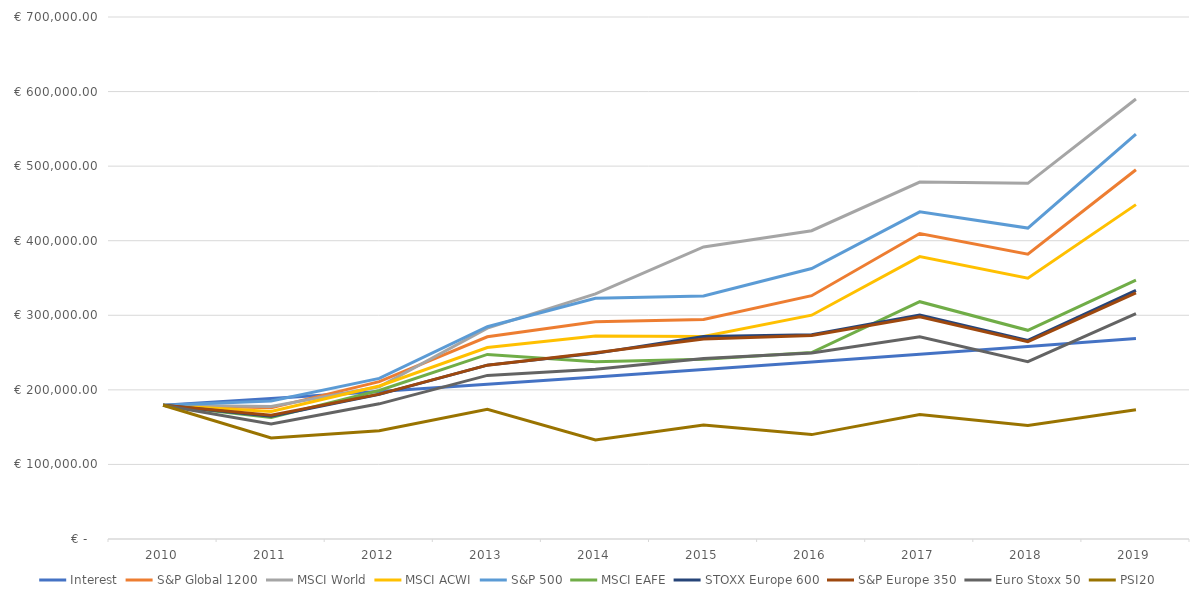
| Category | Interest | S&P Global 1200 | MSCI World | MSCI ACWI | S&P 500 | MSCI EAFE | STOXX Europe 600 | S&P Europe 350 | Euro Stoxx 50 | PSI20 |
|---|---|---|---|---|---|---|---|---|---|---|
| 2010.0 | 179369.678 | 179369.678 | 179369.678 | 179369.678 | 179369.678 | 179369.678 | 179369.678 | 179369.678 | 179369.678 | 179369.678 |
| 2011.0 | 188557.072 | 175850.279 | 177637.281 | 170940.602 | 184963.968 | 163032.377 | 164633.614 | 165879.516 | 154381.099 | 135471.532 |
| 2012.0 | 197928.213 | 211029.797 | 204214.436 | 205169.035 | 215359.666 | 199217.335 | 193891.197 | 194281.057 | 181265.438 | 145038.33 |
| 2013.0 | 207486.778 | 271171.292 | 282718.642 | 256677.749 | 284708.818 | 247538.216 | 233169.809 | 233146.067 | 219397.121 | 173815.635 |
| 2014.0 | 217236.513 | 291405.197 | 328799.605 | 272117.473 | 322738.957 | 237805.578 | 248913.186 | 249698.548 | 227638.496 | 132777.706 |
| 2015.0 | 227181.244 | 294510.572 | 391664.125 | 271706.281 | 325993.936 | 241044.338 | 271422.773 | 268243.083 | 241999.138 | 152728.463 |
| 2016.0 | 237324.868 | 326296.95 | 413410.478 | 300120.55 | 362677.532 | 249952.825 | 273765.492 | 272851.315 | 249302.564 | 139991.007 |
| 2017.0 | 247671.366 | 409693.26 | 478621.807 | 378749.973 | 438709.384 | 318229.548 | 300392.912 | 297842.094 | 271073.607 | 166806.561 |
| 2018.0 | 258224.793 | 381834.017 | 476955.705 | 349789.419 | 416945.94 | 279846.892 | 266218.908 | 264617.988 | 237796.071 | 152072.143 |
| 2019.0 | 268989.289 | 495195.675 | 590036.267 | 448397.331 | 542951.881 | 347134.894 | 333467.528 | 329962.761 | 302320.204 | 173185.431 |